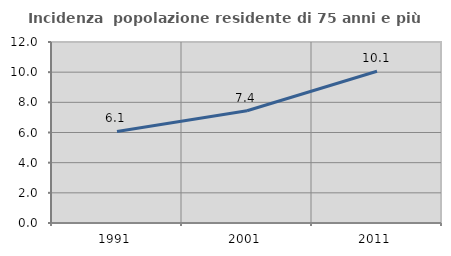
| Category | Incidenza  popolazione residente di 75 anni e più |
|---|---|
| 1991.0 | 6.072 |
| 2001.0 | 7.443 |
| 2011.0 | 10.058 |